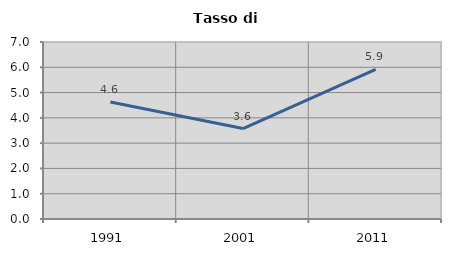
| Category | Tasso di disoccupazione   |
|---|---|
| 1991.0 | 4.627 |
| 2001.0 | 3.578 |
| 2011.0 | 5.921 |